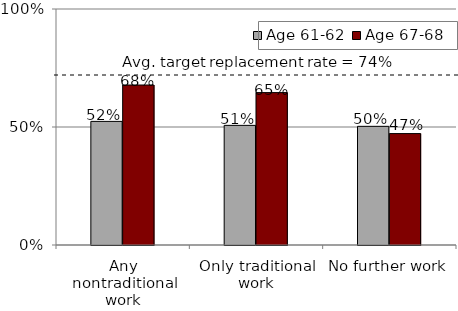
| Category | Age 61-62 | Age 67-68 |
|---|---|---|
| Any nontraditional work | 0.524 | 0.678 |
| Only traditional work | 0.507 | 0.646 |
| No further work | 0.503 | 0.472 |